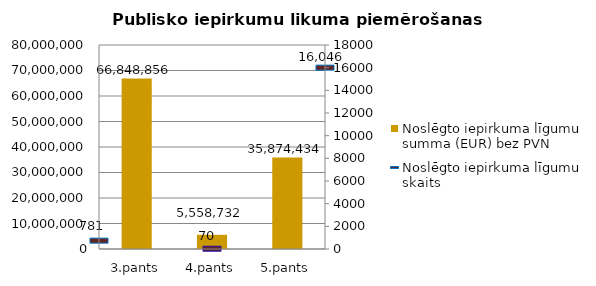
| Category | Noslēgto iepirkuma līgumu summa (EUR) bez PVN |
|---|---|
| 3.pants | 66848856 |
| 4.pants | 5558732 |
| 5.pants | 35874434 |